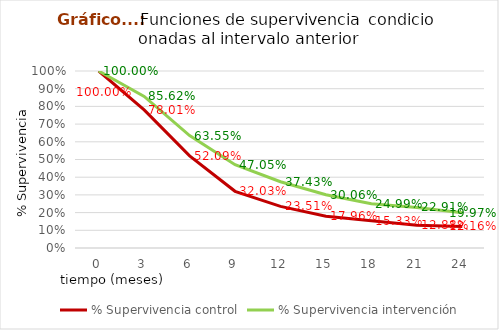
| Category | % Supervivencia control | % Supervivencia intervención |
|---|---|---|
| 0.0 | 1 | 1 |
| 3.0 | 0.78 | 0.856 |
| 6.0 | 0.521 | 0.635 |
| 9.0 | 0.32 | 0.47 |
| 12.0 | 0.235 | 0.374 |
| 15.0 | 0.18 | 0.301 |
| 18.0 | 0.153 | 0.25 |
| 21.0 | 0.129 | 0.229 |
| 24.0 | 0.122 | 0.2 |